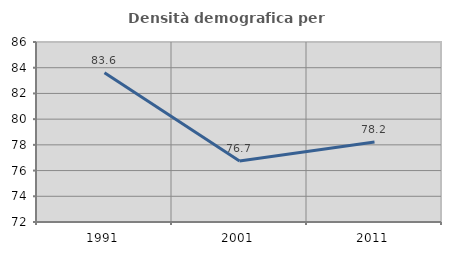
| Category | Densità demografica |
|---|---|
| 1991.0 | 83.612 |
| 2001.0 | 76.737 |
| 2011.0 | 78.224 |